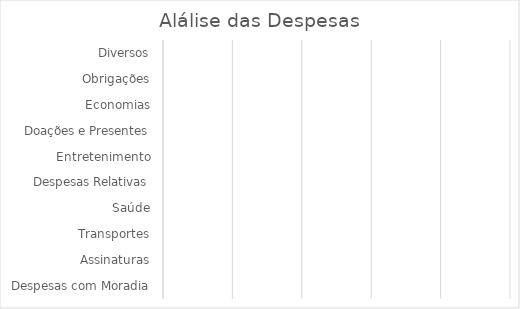
| Category | Series 0 |
|---|---|
| Despesas com Moradia | 0 |
| Assinaturas | 0 |
| Transportes | 0 |
| Saúde | 0 |
| Despesas Relativas | 0 |
| Entretenimento | 0 |
| Doações e Presentes | 0 |
| Economias | 0 |
| Obrigações | 0 |
| Diversos | 0 |